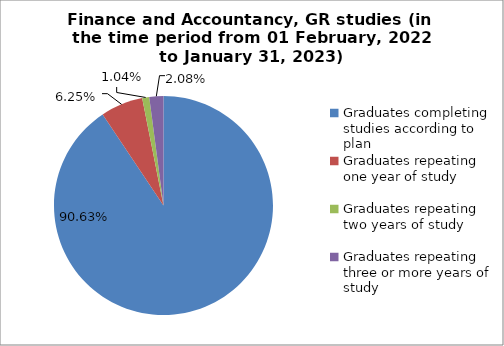
| Category | Series 0 |
|---|---|
| Graduates completing studies according to plan | 90.625 |
| Graduates repeating one year of study | 6.25 |
| Graduates repeating two years of study | 1.042 |
| Graduates repeating three or more years of study | 2.083 |